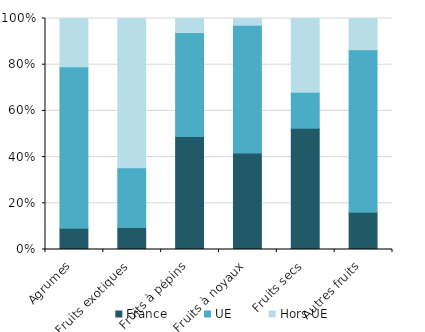
| Category | France | UE | Hors UE |
|---|---|---|---|
| Agrumes | 9359.387 | 70695.845 | 21133.33 |
| Fruits exotiques | 12637.086 | 34281.456 | 85514.467 |
| Fruits à pépins | 32005.513 | 29483.423 | 3988.88 |
| Fruits à noyaux | 17062.93 | 22589.918 | 1184.238 |
| Fruits secs | 1277.477 | 378.486 | 778.394 |
| Autres fruits | 2293.653 | 10025.356 | 1928.823 |